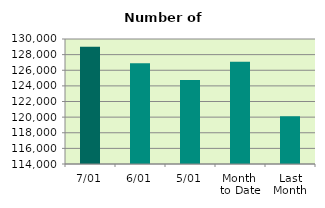
| Category | Series 0 |
|---|---|
| 7/01 | 129016 |
| 6/01 | 126900 |
| 5/01 | 124748 |
| Month 
to Date | 127083.2 |
| Last
Month | 120108.783 |